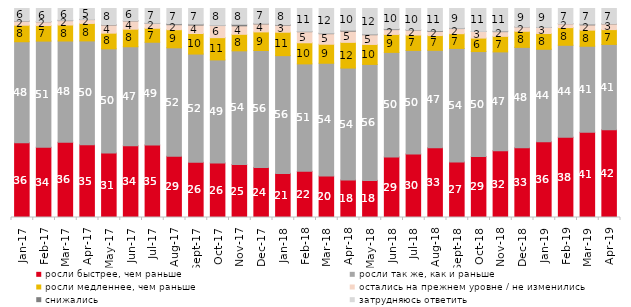
| Category | росли быстрее, чем раньше | росли так же, как и раньше | росли медленнее, чем раньше | остались на прежнем уровне / не изменились | снижались | затрудняюсь ответить |
|---|---|---|---|---|---|---|
| 2017-01-01 | 35.75 | 48.35 | 7.9 | 1.95 | 0.15 | 5.9 |
| 2017-02-01 | 33.65 | 50.75 | 7.45 | 1.8 | 0.1 | 6.25 |
| 2017-03-01 | 36 | 48.45 | 7.65 | 2.1 | 0.2 | 5.6 |
| 2017-04-01 | 34.85 | 49.65 | 8.35 | 1.85 | 0.1 | 5.2 |
| 2017-05-01 | 30.9 | 49.8 | 7.5 | 3.9 | 0.2 | 7.7 |
| 2017-06-01 | 34.3 | 47.4 | 8.4 | 3.95 | 0.15 | 5.8 |
| 2017-07-01 | 34.65 | 49.2 | 6.7 | 2.3 | 0.15 | 7 |
| 2017-08-01 | 29.3 | 51.9 | 8.65 | 2.4 | 0.45 | 7.3 |
| 2017-09-01 | 26.4 | 51.8 | 9.85 | 4 | 0.5 | 7.45 |
| 2017-10-01 | 26.1 | 49.3 | 10.65 | 5.8 | 0.15 | 8 |
| 2017-11-01 | 25.35 | 54.4 | 7.9 | 4.05 | 0.75 | 7.55 |
| 2017-12-01 | 23.95 | 55.95 | 8.9 | 3.8 | 0.3 | 7.1 |
| 2018-01-01 | 21.1 | 56.35 | 11.2 | 3.35 | 0.25 | 7.75 |
| 2018-02-01 | 22.1 | 51.4 | 10.1 | 5.3 | 0.2 | 10.9 |
| 2018-03-01 | 19.8 | 54 | 9.1 | 5.05 | 0.25 | 11.8 |
| 2018-04-01 | 17.95 | 53.55 | 12.3 | 5.35 | 0.45 | 10.4 |
| 2018-05-01 | 17.75 | 55.5 | 9.55 | 4.65 | 0.3 | 12.25 |
| 2018-06-01 | 28.9 | 50.1 | 8.6 | 2.3 | 0.35 | 9.75 |
| 2018-07-01 | 30.35 | 49.6 | 7.35 | 2.4 | 0.15 | 10.15 |
| 2018-08-01 | 33.35 | 46.65 | 7.05 | 2 | 0.35 | 10.6 |
| 2018-09-01 | 26.55 | 54.35 | 7.05 | 2.45 | 0.2 | 9.4 |
| 2018-10-01 | 29.2 | 50.2 | 6.45 | 3.15 | 0.05 | 10.95 |
| 2018-11-01 | 31.886 | 47.355 | 7.435 | 2.246 | 0.299 | 10.778 |
| 2018-12-01 | 33.4 | 48 | 7.7 | 2.1 | 0.05 | 8.75 |
| 2019-01-01 | 36.25 | 44.25 | 7.55 | 2.85 | 0.1 | 9 |
| 2019-02-01 | 38.35 | 44.05 | 8.45 | 1.85 | 0.05 | 7.25 |
| 2019-03-01 | 40.825 | 41.124 | 7.708 | 2.486 | 0.398 | 7.459 |
| 2019-04-01 | 42.03 | 40.792 | 7.079 | 2.723 | 0.149 | 7.228 |